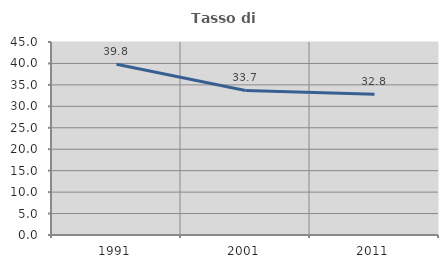
| Category | Tasso di occupazione   |
|---|---|
| 1991.0 | 39.805 |
| 2001.0 | 33.702 |
| 2011.0 | 32.814 |